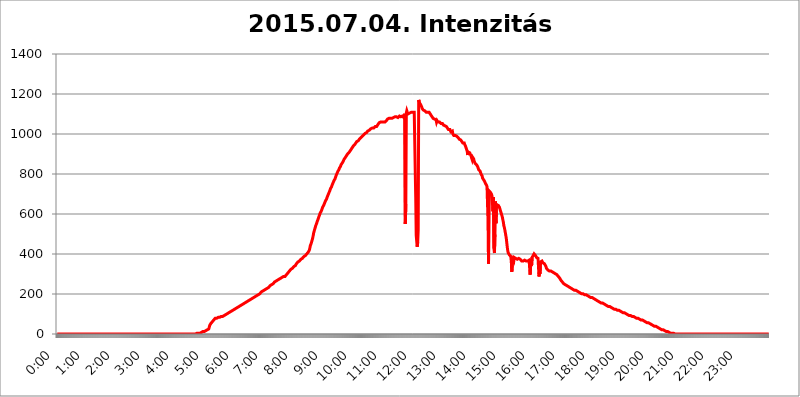
| Category | 2015.07.04. Intenzitás [W/m^2] |
|---|---|
| 0.0 | 0 |
| 0.0006944444444444445 | 0 |
| 0.001388888888888889 | 0 |
| 0.0020833333333333333 | 0 |
| 0.002777777777777778 | 0 |
| 0.003472222222222222 | 0 |
| 0.004166666666666667 | 0 |
| 0.004861111111111111 | 0 |
| 0.005555555555555556 | 0 |
| 0.0062499999999999995 | 0 |
| 0.006944444444444444 | 0 |
| 0.007638888888888889 | 0 |
| 0.008333333333333333 | 0 |
| 0.009027777777777779 | 0 |
| 0.009722222222222222 | 0 |
| 0.010416666666666666 | 0 |
| 0.011111111111111112 | 0 |
| 0.011805555555555555 | 0 |
| 0.012499999999999999 | 0 |
| 0.013194444444444444 | 0 |
| 0.013888888888888888 | 0 |
| 0.014583333333333332 | 0 |
| 0.015277777777777777 | 0 |
| 0.015972222222222224 | 0 |
| 0.016666666666666666 | 0 |
| 0.017361111111111112 | 0 |
| 0.018055555555555557 | 0 |
| 0.01875 | 0 |
| 0.019444444444444445 | 0 |
| 0.02013888888888889 | 0 |
| 0.020833333333333332 | 0 |
| 0.02152777777777778 | 0 |
| 0.022222222222222223 | 0 |
| 0.02291666666666667 | 0 |
| 0.02361111111111111 | 0 |
| 0.024305555555555556 | 0 |
| 0.024999999999999998 | 0 |
| 0.025694444444444447 | 0 |
| 0.02638888888888889 | 0 |
| 0.027083333333333334 | 0 |
| 0.027777777777777776 | 0 |
| 0.02847222222222222 | 0 |
| 0.029166666666666664 | 0 |
| 0.029861111111111113 | 0 |
| 0.030555555555555555 | 0 |
| 0.03125 | 0 |
| 0.03194444444444445 | 0 |
| 0.03263888888888889 | 0 |
| 0.03333333333333333 | 0 |
| 0.034027777777777775 | 0 |
| 0.034722222222222224 | 0 |
| 0.035416666666666666 | 0 |
| 0.036111111111111115 | 0 |
| 0.03680555555555556 | 0 |
| 0.0375 | 0 |
| 0.03819444444444444 | 0 |
| 0.03888888888888889 | 0 |
| 0.03958333333333333 | 0 |
| 0.04027777777777778 | 0 |
| 0.04097222222222222 | 0 |
| 0.041666666666666664 | 0 |
| 0.042361111111111106 | 0 |
| 0.04305555555555556 | 0 |
| 0.043750000000000004 | 0 |
| 0.044444444444444446 | 0 |
| 0.04513888888888889 | 0 |
| 0.04583333333333334 | 0 |
| 0.04652777777777778 | 0 |
| 0.04722222222222222 | 0 |
| 0.04791666666666666 | 0 |
| 0.04861111111111111 | 0 |
| 0.049305555555555554 | 0 |
| 0.049999999999999996 | 0 |
| 0.05069444444444445 | 0 |
| 0.051388888888888894 | 0 |
| 0.052083333333333336 | 0 |
| 0.05277777777777778 | 0 |
| 0.05347222222222222 | 0 |
| 0.05416666666666667 | 0 |
| 0.05486111111111111 | 0 |
| 0.05555555555555555 | 0 |
| 0.05625 | 0 |
| 0.05694444444444444 | 0 |
| 0.057638888888888885 | 0 |
| 0.05833333333333333 | 0 |
| 0.05902777777777778 | 0 |
| 0.059722222222222225 | 0 |
| 0.06041666666666667 | 0 |
| 0.061111111111111116 | 0 |
| 0.06180555555555556 | 0 |
| 0.0625 | 0 |
| 0.06319444444444444 | 0 |
| 0.06388888888888888 | 0 |
| 0.06458333333333334 | 0 |
| 0.06527777777777778 | 0 |
| 0.06597222222222222 | 0 |
| 0.06666666666666667 | 0 |
| 0.06736111111111111 | 0 |
| 0.06805555555555555 | 0 |
| 0.06874999999999999 | 0 |
| 0.06944444444444443 | 0 |
| 0.07013888888888889 | 0 |
| 0.07083333333333333 | 0 |
| 0.07152777777777779 | 0 |
| 0.07222222222222223 | 0 |
| 0.07291666666666667 | 0 |
| 0.07361111111111111 | 0 |
| 0.07430555555555556 | 0 |
| 0.075 | 0 |
| 0.07569444444444444 | 0 |
| 0.0763888888888889 | 0 |
| 0.07708333333333334 | 0 |
| 0.07777777777777778 | 0 |
| 0.07847222222222222 | 0 |
| 0.07916666666666666 | 0 |
| 0.0798611111111111 | 0 |
| 0.08055555555555556 | 0 |
| 0.08125 | 0 |
| 0.08194444444444444 | 0 |
| 0.08263888888888889 | 0 |
| 0.08333333333333333 | 0 |
| 0.08402777777777777 | 0 |
| 0.08472222222222221 | 0 |
| 0.08541666666666665 | 0 |
| 0.08611111111111112 | 0 |
| 0.08680555555555557 | 0 |
| 0.08750000000000001 | 0 |
| 0.08819444444444445 | 0 |
| 0.08888888888888889 | 0 |
| 0.08958333333333333 | 0 |
| 0.09027777777777778 | 0 |
| 0.09097222222222222 | 0 |
| 0.09166666666666667 | 0 |
| 0.09236111111111112 | 0 |
| 0.09305555555555556 | 0 |
| 0.09375 | 0 |
| 0.09444444444444444 | 0 |
| 0.09513888888888888 | 0 |
| 0.09583333333333333 | 0 |
| 0.09652777777777777 | 0 |
| 0.09722222222222222 | 0 |
| 0.09791666666666667 | 0 |
| 0.09861111111111111 | 0 |
| 0.09930555555555555 | 0 |
| 0.09999999999999999 | 0 |
| 0.10069444444444443 | 0 |
| 0.1013888888888889 | 0 |
| 0.10208333333333335 | 0 |
| 0.10277777777777779 | 0 |
| 0.10347222222222223 | 0 |
| 0.10416666666666667 | 0 |
| 0.10486111111111111 | 0 |
| 0.10555555555555556 | 0 |
| 0.10625 | 0 |
| 0.10694444444444444 | 0 |
| 0.1076388888888889 | 0 |
| 0.10833333333333334 | 0 |
| 0.10902777777777778 | 0 |
| 0.10972222222222222 | 0 |
| 0.1111111111111111 | 0 |
| 0.11180555555555556 | 0 |
| 0.11180555555555556 | 0 |
| 0.1125 | 0 |
| 0.11319444444444444 | 0 |
| 0.11388888888888889 | 0 |
| 0.11458333333333333 | 0 |
| 0.11527777777777777 | 0 |
| 0.11597222222222221 | 0 |
| 0.11666666666666665 | 0 |
| 0.1173611111111111 | 0 |
| 0.11805555555555557 | 0 |
| 0.11944444444444445 | 0 |
| 0.12013888888888889 | 0 |
| 0.12083333333333333 | 0 |
| 0.12152777777777778 | 0 |
| 0.12222222222222223 | 0 |
| 0.12291666666666667 | 0 |
| 0.12291666666666667 | 0 |
| 0.12361111111111112 | 0 |
| 0.12430555555555556 | 0 |
| 0.125 | 0 |
| 0.12569444444444444 | 0 |
| 0.12638888888888888 | 0 |
| 0.12708333333333333 | 0 |
| 0.16875 | 0 |
| 0.12847222222222224 | 0 |
| 0.12916666666666668 | 0 |
| 0.12986111111111112 | 0 |
| 0.13055555555555556 | 0 |
| 0.13125 | 0 |
| 0.13194444444444445 | 0 |
| 0.1326388888888889 | 0 |
| 0.13333333333333333 | 0 |
| 0.13402777777777777 | 0 |
| 0.13402777777777777 | 0 |
| 0.13472222222222222 | 0 |
| 0.13541666666666666 | 0 |
| 0.1361111111111111 | 0 |
| 0.13749999999999998 | 0 |
| 0.13819444444444443 | 0 |
| 0.1388888888888889 | 0 |
| 0.13958333333333334 | 0 |
| 0.14027777777777778 | 0 |
| 0.14097222222222222 | 0 |
| 0.14166666666666666 | 0 |
| 0.1423611111111111 | 0 |
| 0.14305555555555557 | 0 |
| 0.14375000000000002 | 0 |
| 0.14444444444444446 | 0 |
| 0.1451388888888889 | 0 |
| 0.1451388888888889 | 0 |
| 0.14652777777777778 | 0 |
| 0.14722222222222223 | 0 |
| 0.14791666666666667 | 0 |
| 0.1486111111111111 | 0 |
| 0.14930555555555555 | 0 |
| 0.15 | 0 |
| 0.15069444444444444 | 0 |
| 0.15138888888888888 | 0 |
| 0.15208333333333332 | 0 |
| 0.15277777777777776 | 0 |
| 0.15347222222222223 | 0 |
| 0.15416666666666667 | 0 |
| 0.15486111111111112 | 0 |
| 0.15555555555555556 | 0 |
| 0.15625 | 0 |
| 0.15694444444444444 | 0 |
| 0.15763888888888888 | 0 |
| 0.15833333333333333 | 0 |
| 0.15902777777777777 | 0 |
| 0.15972222222222224 | 0 |
| 0.16041666666666668 | 0 |
| 0.16111111111111112 | 0 |
| 0.16180555555555556 | 0 |
| 0.1625 | 0 |
| 0.16319444444444445 | 0 |
| 0.1638888888888889 | 0 |
| 0.16458333333333333 | 0 |
| 0.16527777777777777 | 0 |
| 0.16597222222222222 | 0 |
| 0.16666666666666666 | 0 |
| 0.1673611111111111 | 0 |
| 0.16805555555555554 | 0 |
| 0.16874999999999998 | 0 |
| 0.16944444444444443 | 0 |
| 0.17013888888888887 | 0 |
| 0.1708333333333333 | 0 |
| 0.17152777777777775 | 0 |
| 0.17222222222222225 | 0 |
| 0.1729166666666667 | 0 |
| 0.17361111111111113 | 0 |
| 0.17430555555555557 | 0 |
| 0.17500000000000002 | 0 |
| 0.17569444444444446 | 0 |
| 0.1763888888888889 | 0 |
| 0.17708333333333334 | 0 |
| 0.17777777777777778 | 0 |
| 0.17847222222222223 | 0 |
| 0.17916666666666667 | 0 |
| 0.1798611111111111 | 0 |
| 0.18055555555555555 | 0 |
| 0.18125 | 0 |
| 0.18194444444444444 | 0 |
| 0.1826388888888889 | 0 |
| 0.18333333333333335 | 0 |
| 0.1840277777777778 | 0 |
| 0.18472222222222223 | 0 |
| 0.18541666666666667 | 0 |
| 0.18611111111111112 | 0 |
| 0.18680555555555556 | 0 |
| 0.1875 | 0 |
| 0.18819444444444444 | 0 |
| 0.18888888888888888 | 0 |
| 0.18958333333333333 | 0 |
| 0.19027777777777777 | 0 |
| 0.1909722222222222 | 0 |
| 0.19166666666666665 | 0 |
| 0.19236111111111112 | 0 |
| 0.19305555555555554 | 0 |
| 0.19375 | 0 |
| 0.19444444444444445 | 0 |
| 0.1951388888888889 | 3.525 |
| 0.19583333333333333 | 3.525 |
| 0.19652777777777777 | 3.525 |
| 0.19722222222222222 | 3.525 |
| 0.19791666666666666 | 3.525 |
| 0.1986111111111111 | 3.525 |
| 0.19930555555555554 | 3.525 |
| 0.19999999999999998 | 3.525 |
| 0.20069444444444443 | 7.887 |
| 0.20138888888888887 | 7.887 |
| 0.2020833333333333 | 7.887 |
| 0.2027777777777778 | 7.887 |
| 0.2034722222222222 | 7.887 |
| 0.2041666666666667 | 12.257 |
| 0.20486111111111113 | 12.257 |
| 0.20555555555555557 | 12.257 |
| 0.20625000000000002 | 12.257 |
| 0.20694444444444446 | 16.636 |
| 0.2076388888888889 | 16.636 |
| 0.20833333333333334 | 16.636 |
| 0.20902777777777778 | 21.024 |
| 0.20972222222222223 | 21.024 |
| 0.21041666666666667 | 21.024 |
| 0.2111111111111111 | 25.419 |
| 0.21180555555555555 | 25.419 |
| 0.2125 | 25.419 |
| 0.21319444444444444 | 34.234 |
| 0.2138888888888889 | 43.079 |
| 0.21458333333333335 | 47.511 |
| 0.2152777777777778 | 51.951 |
| 0.21597222222222223 | 56.398 |
| 0.21666666666666667 | 56.398 |
| 0.21736111111111112 | 60.85 |
| 0.21805555555555556 | 65.31 |
| 0.21875 | 65.31 |
| 0.21944444444444444 | 69.775 |
| 0.22013888888888888 | 69.775 |
| 0.22083333333333333 | 74.246 |
| 0.22152777777777777 | 78.722 |
| 0.2222222222222222 | 78.722 |
| 0.22291666666666665 | 83.205 |
| 0.2236111111111111 | 78.722 |
| 0.22430555555555556 | 78.722 |
| 0.225 | 78.722 |
| 0.22569444444444445 | 83.205 |
| 0.2263888888888889 | 83.205 |
| 0.22708333333333333 | 83.205 |
| 0.22777777777777777 | 83.205 |
| 0.22847222222222222 | 87.692 |
| 0.22916666666666666 | 87.692 |
| 0.2298611111111111 | 87.692 |
| 0.23055555555555554 | 87.692 |
| 0.23124999999999998 | 87.692 |
| 0.23194444444444443 | 87.692 |
| 0.23263888888888887 | 87.692 |
| 0.2333333333333333 | 92.184 |
| 0.2340277777777778 | 92.184 |
| 0.2347222222222222 | 92.184 |
| 0.2354166666666667 | 96.682 |
| 0.23611111111111113 | 96.682 |
| 0.23680555555555557 | 96.682 |
| 0.23750000000000002 | 101.184 |
| 0.23819444444444446 | 101.184 |
| 0.2388888888888889 | 101.184 |
| 0.23958333333333334 | 105.69 |
| 0.24027777777777778 | 105.69 |
| 0.24097222222222223 | 110.201 |
| 0.24166666666666667 | 110.201 |
| 0.2423611111111111 | 110.201 |
| 0.24305555555555555 | 114.716 |
| 0.24375 | 114.716 |
| 0.24444444444444446 | 114.716 |
| 0.24513888888888888 | 119.235 |
| 0.24583333333333335 | 119.235 |
| 0.2465277777777778 | 119.235 |
| 0.24722222222222223 | 119.235 |
| 0.24791666666666667 | 123.758 |
| 0.24861111111111112 | 123.758 |
| 0.24930555555555556 | 123.758 |
| 0.25 | 128.284 |
| 0.25069444444444444 | 128.284 |
| 0.2513888888888889 | 128.284 |
| 0.2520833333333333 | 128.284 |
| 0.25277777777777777 | 132.814 |
| 0.2534722222222222 | 132.814 |
| 0.25416666666666665 | 137.347 |
| 0.2548611111111111 | 137.347 |
| 0.2555555555555556 | 137.347 |
| 0.25625000000000003 | 137.347 |
| 0.2569444444444445 | 141.884 |
| 0.2576388888888889 | 141.884 |
| 0.25833333333333336 | 141.884 |
| 0.2590277777777778 | 146.423 |
| 0.25972222222222224 | 146.423 |
| 0.2604166666666667 | 146.423 |
| 0.2611111111111111 | 150.964 |
| 0.26180555555555557 | 150.964 |
| 0.2625 | 150.964 |
| 0.26319444444444445 | 155.509 |
| 0.2638888888888889 | 155.509 |
| 0.26458333333333334 | 155.509 |
| 0.2652777777777778 | 160.056 |
| 0.2659722222222222 | 160.056 |
| 0.26666666666666666 | 160.056 |
| 0.2673611111111111 | 164.605 |
| 0.26805555555555555 | 164.605 |
| 0.26875 | 164.605 |
| 0.26944444444444443 | 169.156 |
| 0.2701388888888889 | 169.156 |
| 0.2708333333333333 | 169.156 |
| 0.27152777777777776 | 173.709 |
| 0.2722222222222222 | 173.709 |
| 0.27291666666666664 | 173.709 |
| 0.2736111111111111 | 178.264 |
| 0.2743055555555555 | 178.264 |
| 0.27499999999999997 | 178.264 |
| 0.27569444444444446 | 182.82 |
| 0.27638888888888885 | 182.82 |
| 0.27708333333333335 | 182.82 |
| 0.2777777777777778 | 187.378 |
| 0.27847222222222223 | 187.378 |
| 0.2791666666666667 | 187.378 |
| 0.2798611111111111 | 191.937 |
| 0.28055555555555556 | 191.937 |
| 0.28125 | 191.937 |
| 0.28194444444444444 | 196.497 |
| 0.2826388888888889 | 196.497 |
| 0.2833333333333333 | 201.058 |
| 0.28402777777777777 | 201.058 |
| 0.2847222222222222 | 201.058 |
| 0.28541666666666665 | 205.62 |
| 0.28611111111111115 | 210.182 |
| 0.28680555555555554 | 210.182 |
| 0.28750000000000003 | 210.182 |
| 0.2881944444444445 | 214.746 |
| 0.2888888888888889 | 214.746 |
| 0.28958333333333336 | 214.746 |
| 0.2902777777777778 | 219.309 |
| 0.29097222222222224 | 219.309 |
| 0.2916666666666667 | 219.309 |
| 0.2923611111111111 | 223.873 |
| 0.29305555555555557 | 228.436 |
| 0.29375 | 228.436 |
| 0.29444444444444445 | 228.436 |
| 0.2951388888888889 | 233 |
| 0.29583333333333334 | 233 |
| 0.2965277777777778 | 233 |
| 0.2972222222222222 | 237.564 |
| 0.29791666666666666 | 237.564 |
| 0.2986111111111111 | 242.127 |
| 0.29930555555555555 | 242.127 |
| 0.3 | 242.127 |
| 0.30069444444444443 | 246.689 |
| 0.3013888888888889 | 251.251 |
| 0.3020833333333333 | 251.251 |
| 0.30277777777777776 | 251.251 |
| 0.3034722222222222 | 255.813 |
| 0.30416666666666664 | 255.813 |
| 0.3048611111111111 | 260.373 |
| 0.3055555555555555 | 260.373 |
| 0.30624999999999997 | 260.373 |
| 0.3069444444444444 | 264.932 |
| 0.3076388888888889 | 264.932 |
| 0.30833333333333335 | 269.49 |
| 0.3090277777777778 | 269.49 |
| 0.30972222222222223 | 269.49 |
| 0.3104166666666667 | 274.047 |
| 0.3111111111111111 | 274.047 |
| 0.31180555555555556 | 274.047 |
| 0.3125 | 278.603 |
| 0.31319444444444444 | 278.603 |
| 0.3138888888888889 | 278.603 |
| 0.3145833333333333 | 278.603 |
| 0.31527777777777777 | 283.156 |
| 0.3159722222222222 | 283.156 |
| 0.31666666666666665 | 283.156 |
| 0.31736111111111115 | 287.709 |
| 0.31805555555555554 | 287.709 |
| 0.31875000000000003 | 287.709 |
| 0.3194444444444445 | 287.709 |
| 0.3201388888888889 | 292.259 |
| 0.32083333333333336 | 292.259 |
| 0.3215277777777778 | 296.808 |
| 0.32222222222222224 | 296.808 |
| 0.3229166666666667 | 301.354 |
| 0.3236111111111111 | 305.898 |
| 0.32430555555555557 | 305.898 |
| 0.325 | 310.44 |
| 0.32569444444444445 | 314.98 |
| 0.3263888888888889 | 314.98 |
| 0.32708333333333334 | 319.517 |
| 0.3277777777777778 | 324.052 |
| 0.3284722222222222 | 324.052 |
| 0.32916666666666666 | 328.584 |
| 0.3298611111111111 | 328.584 |
| 0.33055555555555555 | 333.113 |
| 0.33125 | 333.113 |
| 0.33194444444444443 | 337.639 |
| 0.3326388888888889 | 342.162 |
| 0.3333333333333333 | 342.162 |
| 0.3340277777777778 | 342.162 |
| 0.3347222222222222 | 346.682 |
| 0.3354166666666667 | 351.198 |
| 0.3361111111111111 | 351.198 |
| 0.3368055555555556 | 355.712 |
| 0.33749999999999997 | 360.221 |
| 0.33819444444444446 | 360.221 |
| 0.33888888888888885 | 360.221 |
| 0.33958333333333335 | 364.728 |
| 0.34027777777777773 | 369.23 |
| 0.34097222222222223 | 369.23 |
| 0.3416666666666666 | 373.729 |
| 0.3423611111111111 | 373.729 |
| 0.3430555555555555 | 378.224 |
| 0.34375 | 378.224 |
| 0.3444444444444445 | 382.715 |
| 0.3451388888888889 | 382.715 |
| 0.3458333333333334 | 387.202 |
| 0.34652777777777777 | 387.202 |
| 0.34722222222222227 | 391.685 |
| 0.34791666666666665 | 391.685 |
| 0.34861111111111115 | 396.164 |
| 0.34930555555555554 | 396.164 |
| 0.35000000000000003 | 400.638 |
| 0.3506944444444444 | 405.108 |
| 0.3513888888888889 | 405.108 |
| 0.3520833333333333 | 409.574 |
| 0.3527777777777778 | 414.035 |
| 0.3534722222222222 | 418.492 |
| 0.3541666666666667 | 427.39 |
| 0.3548611111111111 | 440.702 |
| 0.35555555555555557 | 445.129 |
| 0.35625 | 453.968 |
| 0.35694444444444445 | 462.786 |
| 0.3576388888888889 | 471.582 |
| 0.35833333333333334 | 480.356 |
| 0.3590277777777778 | 493.475 |
| 0.3597222222222222 | 506.542 |
| 0.36041666666666666 | 515.223 |
| 0.3611111111111111 | 523.88 |
| 0.36180555555555555 | 532.513 |
| 0.3625 | 541.121 |
| 0.36319444444444443 | 545.416 |
| 0.3638888888888889 | 553.986 |
| 0.3645833333333333 | 562.53 |
| 0.3652777777777778 | 566.793 |
| 0.3659722222222222 | 575.299 |
| 0.3666666666666667 | 583.779 |
| 0.3673611111111111 | 588.009 |
| 0.3680555555555556 | 596.45 |
| 0.36874999999999997 | 604.864 |
| 0.36944444444444446 | 609.062 |
| 0.37013888888888885 | 613.252 |
| 0.37083333333333335 | 617.436 |
| 0.37152777777777773 | 625.784 |
| 0.37222222222222223 | 634.105 |
| 0.3729166666666666 | 638.256 |
| 0.3736111111111111 | 642.4 |
| 0.3743055555555555 | 646.537 |
| 0.375 | 654.791 |
| 0.3756944444444445 | 658.909 |
| 0.3763888888888889 | 667.123 |
| 0.3770833333333334 | 671.22 |
| 0.37777777777777777 | 675.311 |
| 0.37847222222222227 | 683.473 |
| 0.37916666666666665 | 687.544 |
| 0.37986111111111115 | 695.666 |
| 0.38055555555555554 | 699.717 |
| 0.38125000000000003 | 707.8 |
| 0.3819444444444444 | 711.832 |
| 0.3826388888888889 | 719.877 |
| 0.3833333333333333 | 727.896 |
| 0.3840277777777778 | 731.896 |
| 0.3847222222222222 | 735.89 |
| 0.3854166666666667 | 743.859 |
| 0.3861111111111111 | 747.834 |
| 0.38680555555555557 | 755.766 |
| 0.3875 | 759.723 |
| 0.38819444444444445 | 767.62 |
| 0.3888888888888889 | 771.559 |
| 0.38958333333333334 | 775.492 |
| 0.3902777777777778 | 783.342 |
| 0.3909722222222222 | 791.169 |
| 0.39166666666666666 | 795.074 |
| 0.3923611111111111 | 802.868 |
| 0.39305555555555555 | 806.757 |
| 0.39375 | 814.519 |
| 0.39444444444444443 | 818.392 |
| 0.3951388888888889 | 822.26 |
| 0.3958333333333333 | 829.981 |
| 0.3965277777777778 | 833.834 |
| 0.3972222222222222 | 837.682 |
| 0.3979166666666667 | 845.365 |
| 0.3986111111111111 | 849.199 |
| 0.3993055555555556 | 853.029 |
| 0.39999999999999997 | 856.855 |
| 0.40069444444444446 | 860.676 |
| 0.40138888888888885 | 864.493 |
| 0.40208333333333335 | 872.114 |
| 0.40277777777777773 | 875.918 |
| 0.40347222222222223 | 879.719 |
| 0.4041666666666666 | 883.516 |
| 0.4048611111111111 | 887.309 |
| 0.4055555555555555 | 891.099 |
| 0.40625 | 894.885 |
| 0.4069444444444445 | 894.885 |
| 0.4076388888888889 | 902.447 |
| 0.4083333333333334 | 906.223 |
| 0.40902777777777777 | 906.223 |
| 0.40972222222222227 | 909.996 |
| 0.41041666666666665 | 913.766 |
| 0.41111111111111115 | 917.534 |
| 0.41180555555555554 | 921.298 |
| 0.41250000000000003 | 925.06 |
| 0.4131944444444444 | 928.819 |
| 0.4138888888888889 | 932.576 |
| 0.4145833333333333 | 936.33 |
| 0.4152777777777778 | 940.082 |
| 0.4159722222222222 | 943.832 |
| 0.4166666666666667 | 943.832 |
| 0.4173611111111111 | 947.58 |
| 0.41805555555555557 | 951.327 |
| 0.41875 | 955.071 |
| 0.41944444444444445 | 958.814 |
| 0.4201388888888889 | 962.555 |
| 0.42083333333333334 | 962.555 |
| 0.4215277777777778 | 966.295 |
| 0.4222222222222222 | 966.295 |
| 0.42291666666666666 | 970.034 |
| 0.4236111111111111 | 973.772 |
| 0.42430555555555555 | 973.772 |
| 0.425 | 977.508 |
| 0.42569444444444443 | 981.244 |
| 0.4263888888888889 | 984.98 |
| 0.4270833333333333 | 984.98 |
| 0.4277777777777778 | 988.714 |
| 0.4284722222222222 | 988.714 |
| 0.4291666666666667 | 992.448 |
| 0.4298611111111111 | 996.182 |
| 0.4305555555555556 | 999.916 |
| 0.43124999999999997 | 999.916 |
| 0.43194444444444446 | 1003.65 |
| 0.43263888888888885 | 1003.65 |
| 0.43333333333333335 | 1007.383 |
| 0.43402777777777773 | 1007.383 |
| 0.43472222222222223 | 1011.118 |
| 0.4354166666666666 | 1014.852 |
| 0.4361111111111111 | 1014.852 |
| 0.4368055555555555 | 1018.587 |
| 0.4375 | 1018.587 |
| 0.4381944444444445 | 1022.323 |
| 0.4388888888888889 | 1022.323 |
| 0.4395833333333334 | 1026.06 |
| 0.44027777777777777 | 1029.798 |
| 0.44097222222222227 | 1029.798 |
| 0.44166666666666665 | 1029.798 |
| 0.44236111111111115 | 1029.798 |
| 0.44305555555555554 | 1029.798 |
| 0.44375000000000003 | 1029.798 |
| 0.4444444444444444 | 1033.537 |
| 0.4451388888888889 | 1033.537 |
| 0.4458333333333333 | 1037.277 |
| 0.4465277777777778 | 1037.277 |
| 0.4472222222222222 | 1041.019 |
| 0.4479166666666667 | 1037.277 |
| 0.4486111111111111 | 1041.019 |
| 0.44930555555555557 | 1044.762 |
| 0.45 | 1044.762 |
| 0.45069444444444445 | 1048.508 |
| 0.4513888888888889 | 1056.004 |
| 0.45208333333333334 | 1056.004 |
| 0.4527777777777778 | 1059.756 |
| 0.4534722222222222 | 1059.756 |
| 0.45416666666666666 | 1059.756 |
| 0.4548611111111111 | 1059.756 |
| 0.45555555555555555 | 1059.756 |
| 0.45625 | 1056.004 |
| 0.45694444444444443 | 1059.756 |
| 0.4576388888888889 | 1059.756 |
| 0.4583333333333333 | 1059.756 |
| 0.4590277777777778 | 1059.756 |
| 0.4597222222222222 | 1059.756 |
| 0.4604166666666667 | 1063.51 |
| 0.4611111111111111 | 1063.51 |
| 0.4618055555555556 | 1067.267 |
| 0.46249999999999997 | 1071.027 |
| 0.46319444444444446 | 1074.789 |
| 0.46388888888888885 | 1074.789 |
| 0.46458333333333335 | 1078.555 |
| 0.46527777777777773 | 1078.555 |
| 0.46597222222222223 | 1078.555 |
| 0.4666666666666666 | 1082.324 |
| 0.4673611111111111 | 1078.555 |
| 0.4680555555555555 | 1078.555 |
| 0.46875 | 1074.789 |
| 0.4694444444444445 | 1078.555 |
| 0.4701388888888889 | 1082.324 |
| 0.4708333333333334 | 1082.324 |
| 0.47152777777777777 | 1082.324 |
| 0.47222222222222227 | 1082.324 |
| 0.47291666666666665 | 1086.097 |
| 0.47361111111111115 | 1086.097 |
| 0.47430555555555554 | 1086.097 |
| 0.47500000000000003 | 1086.097 |
| 0.4756944444444444 | 1086.097 |
| 0.4763888888888889 | 1086.097 |
| 0.4770833333333333 | 1082.324 |
| 0.4777777777777778 | 1082.324 |
| 0.4784722222222222 | 1082.324 |
| 0.4791666666666667 | 1082.324 |
| 0.4798611111111111 | 1089.873 |
| 0.48055555555555557 | 1086.097 |
| 0.48125 | 1086.097 |
| 0.48194444444444445 | 1086.097 |
| 0.4826388888888889 | 1086.097 |
| 0.48333333333333334 | 1086.097 |
| 0.4840277777777778 | 1089.873 |
| 0.4847222222222222 | 1086.097 |
| 0.48541666666666666 | 1086.097 |
| 0.4861111111111111 | 1082.324 |
| 0.48680555555555555 | 1078.555 |
| 0.4875 | 1101.226 |
| 0.48819444444444443 | 549.704 |
| 0.4888888888888889 | 650.667 |
| 0.4895833333333333 | 1105.019 |
| 0.4902777777777778 | 1116.426 |
| 0.4909722222222222 | 1108.816 |
| 0.4916666666666667 | 1105.019 |
| 0.4923611111111111 | 1101.226 |
| 0.4930555555555556 | 1101.226 |
| 0.49374999999999997 | 1101.226 |
| 0.49444444444444446 | 1105.019 |
| 0.49513888888888885 | 1105.019 |
| 0.49583333333333335 | 1108.816 |
| 0.49652777777777773 | 1108.816 |
| 0.49722222222222223 | 1108.816 |
| 0.4979166666666666 | 1108.816 |
| 0.4986111111111111 | 1108.816 |
| 0.4993055555555555 | 1108.816 |
| 0.5 | 1112.618 |
| 0.5006944444444444 | 1108.816 |
| 0.5013888888888889 | 1105.019 |
| 0.5020833333333333 | 818.392 |
| 0.5027777777777778 | 683.473 |
| 0.5034722222222222 | 493.475 |
| 0.5041666666666667 | 462.786 |
| 0.5048611111111111 | 436.27 |
| 0.5055555555555555 | 458.38 |
| 0.50625 | 519.555 |
| 0.5069444444444444 | 1170.358 |
| 0.5076388888888889 | 1162.571 |
| 0.5083333333333333 | 1154.814 |
| 0.5090277777777777 | 1154.814 |
| 0.5097222222222222 | 1147.086 |
| 0.5104166666666666 | 1143.232 |
| 0.5111111111111112 | 1135.543 |
| 0.5118055555555555 | 1127.879 |
| 0.5125000000000001 | 1124.056 |
| 0.5131944444444444 | 1120.238 |
| 0.513888888888889 | 1120.238 |
| 0.5145833333333333 | 1116.426 |
| 0.5152777777777778 | 1116.426 |
| 0.5159722222222222 | 1116.426 |
| 0.5166666666666667 | 1112.618 |
| 0.517361111111111 | 1108.816 |
| 0.5180555555555556 | 1108.816 |
| 0.5187499999999999 | 1108.816 |
| 0.5194444444444445 | 1108.816 |
| 0.5201388888888888 | 1108.816 |
| 0.5208333333333334 | 1112.618 |
| 0.5215277777777778 | 1108.816 |
| 0.5222222222222223 | 1105.019 |
| 0.5229166666666667 | 1101.226 |
| 0.5236111111111111 | 1097.437 |
| 0.5243055555555556 | 1093.653 |
| 0.525 | 1089.873 |
| 0.5256944444444445 | 1086.097 |
| 0.5263888888888889 | 1082.324 |
| 0.5270833333333333 | 1078.555 |
| 0.5277777777777778 | 1074.789 |
| 0.5284722222222222 | 1078.555 |
| 0.5291666666666667 | 1074.789 |
| 0.5298611111111111 | 1074.789 |
| 0.5305555555555556 | 1071.027 |
| 0.53125 | 1071.027 |
| 0.5319444444444444 | 1059.756 |
| 0.5326388888888889 | 1067.267 |
| 0.5333333333333333 | 1063.51 |
| 0.5340277777777778 | 1059.756 |
| 0.5347222222222222 | 1063.51 |
| 0.5354166666666667 | 1059.756 |
| 0.5361111111111111 | 1059.756 |
| 0.5368055555555555 | 1056.004 |
| 0.5375 | 1056.004 |
| 0.5381944444444444 | 1052.255 |
| 0.5388888888888889 | 1052.255 |
| 0.5395833333333333 | 1052.255 |
| 0.5402777777777777 | 1052.255 |
| 0.5409722222222222 | 1048.508 |
| 0.5416666666666666 | 1044.762 |
| 0.5423611111111112 | 1044.762 |
| 0.5430555555555555 | 1044.762 |
| 0.5437500000000001 | 1041.019 |
| 0.5444444444444444 | 1041.019 |
| 0.545138888888889 | 1041.019 |
| 0.5458333333333333 | 1037.277 |
| 0.5465277777777778 | 1037.277 |
| 0.5472222222222222 | 1029.798 |
| 0.5479166666666667 | 1029.798 |
| 0.548611111111111 | 1022.323 |
| 0.5493055555555556 | 1026.06 |
| 0.5499999999999999 | 1022.323 |
| 0.5506944444444445 | 1022.323 |
| 0.5513888888888888 | 1026.06 |
| 0.5520833333333334 | 1011.118 |
| 0.5527777777777778 | 1007.383 |
| 0.5534722222222223 | 1007.383 |
| 0.5541666666666667 | 1014.852 |
| 0.5548611111111111 | 999.916 |
| 0.5555555555555556 | 999.916 |
| 0.55625 | 992.448 |
| 0.5569444444444445 | 996.182 |
| 0.5576388888888889 | 992.448 |
| 0.5583333333333333 | 992.448 |
| 0.5590277777777778 | 992.448 |
| 0.5597222222222222 | 988.714 |
| 0.5604166666666667 | 988.714 |
| 0.5611111111111111 | 984.98 |
| 0.5618055555555556 | 984.98 |
| 0.5625 | 981.244 |
| 0.5631944444444444 | 977.508 |
| 0.5638888888888889 | 973.772 |
| 0.5645833333333333 | 973.772 |
| 0.5652777777777778 | 970.034 |
| 0.5659722222222222 | 970.034 |
| 0.5666666666666667 | 966.295 |
| 0.5673611111111111 | 962.555 |
| 0.5680555555555555 | 958.814 |
| 0.56875 | 955.071 |
| 0.5694444444444444 | 955.071 |
| 0.5701388888888889 | 955.071 |
| 0.5708333333333333 | 955.071 |
| 0.5715277777777777 | 947.58 |
| 0.5722222222222222 | 943.832 |
| 0.5729166666666666 | 936.33 |
| 0.5736111111111112 | 928.819 |
| 0.5743055555555555 | 925.06 |
| 0.5750000000000001 | 913.766 |
| 0.5756944444444444 | 894.885 |
| 0.576388888888889 | 909.996 |
| 0.5770833333333333 | 909.996 |
| 0.5777777777777778 | 913.766 |
| 0.5784722222222222 | 906.223 |
| 0.5791666666666667 | 902.447 |
| 0.579861111111111 | 894.885 |
| 0.5805555555555556 | 887.309 |
| 0.5812499999999999 | 887.309 |
| 0.5819444444444445 | 872.114 |
| 0.5826388888888888 | 883.516 |
| 0.5833333333333334 | 879.719 |
| 0.5840277777777778 | 875.918 |
| 0.5847222222222223 | 864.493 |
| 0.5854166666666667 | 860.676 |
| 0.5861111111111111 | 853.029 |
| 0.5868055555555556 | 853.029 |
| 0.5875 | 853.029 |
| 0.5881944444444445 | 845.365 |
| 0.5888888888888889 | 841.526 |
| 0.5895833333333333 | 837.682 |
| 0.5902777777777778 | 829.981 |
| 0.5909722222222222 | 822.26 |
| 0.5916666666666667 | 822.26 |
| 0.5923611111111111 | 818.392 |
| 0.5930555555555556 | 814.519 |
| 0.59375 | 806.757 |
| 0.5944444444444444 | 798.974 |
| 0.5951388888888889 | 795.074 |
| 0.5958333333333333 | 791.169 |
| 0.5965277777777778 | 779.42 |
| 0.5972222222222222 | 775.492 |
| 0.5979166666666667 | 771.559 |
| 0.5986111111111111 | 767.62 |
| 0.5993055555555555 | 763.674 |
| 0.6 | 759.723 |
| 0.6006944444444444 | 751.803 |
| 0.6013888888888889 | 747.834 |
| 0.6020833333333333 | 743.859 |
| 0.6027777777777777 | 735.89 |
| 0.6034722222222222 | 735.89 |
| 0.6041666666666666 | 566.793 |
| 0.6048611111111112 | 351.198 |
| 0.6055555555555555 | 715.858 |
| 0.6062500000000001 | 715.858 |
| 0.6069444444444444 | 711.832 |
| 0.607638888888889 | 707.8 |
| 0.6083333333333333 | 703.762 |
| 0.6090277777777778 | 699.717 |
| 0.6097222222222222 | 691.608 |
| 0.6104166666666667 | 695.666 |
| 0.611111111111111 | 613.252 |
| 0.6118055555555556 | 683.473 |
| 0.6124999999999999 | 427.39 |
| 0.6131944444444445 | 405.108 |
| 0.6138888888888888 | 497.836 |
| 0.6145833333333334 | 663.019 |
| 0.6152777777777778 | 553.986 |
| 0.6159722222222223 | 638.256 |
| 0.6166666666666667 | 646.537 |
| 0.6173611111111111 | 642.4 |
| 0.6180555555555556 | 642.4 |
| 0.61875 | 642.4 |
| 0.6194444444444445 | 638.256 |
| 0.6201388888888889 | 634.105 |
| 0.6208333333333333 | 625.784 |
| 0.6215277777777778 | 617.436 |
| 0.6222222222222222 | 609.062 |
| 0.6229166666666667 | 600.661 |
| 0.6236111111111111 | 592.233 |
| 0.6243055555555556 | 583.779 |
| 0.625 | 571.049 |
| 0.6256944444444444 | 558.261 |
| 0.6263888888888889 | 541.121 |
| 0.6270833333333333 | 532.513 |
| 0.6277777777777778 | 519.555 |
| 0.6284722222222222 | 506.542 |
| 0.6291666666666667 | 502.192 |
| 0.6298611111111111 | 475.972 |
| 0.6305555555555555 | 453.968 |
| 0.63125 | 431.833 |
| 0.6319444444444444 | 414.035 |
| 0.6326388888888889 | 405.108 |
| 0.6333333333333333 | 400.638 |
| 0.6340277777777777 | 396.164 |
| 0.6347222222222222 | 396.164 |
| 0.6354166666666666 | 391.685 |
| 0.6361111111111112 | 387.202 |
| 0.6368055555555555 | 364.728 |
| 0.6375000000000001 | 310.44 |
| 0.6381944444444444 | 305.898 |
| 0.638888888888889 | 373.729 |
| 0.6395833333333333 | 378.224 |
| 0.6402777777777778 | 364.728 |
| 0.6409722222222222 | 382.715 |
| 0.6416666666666667 | 387.202 |
| 0.642361111111111 | 382.715 |
| 0.6430555555555556 | 378.224 |
| 0.6437499999999999 | 373.729 |
| 0.6444444444444445 | 373.729 |
| 0.6451388888888888 | 373.729 |
| 0.6458333333333334 | 373.729 |
| 0.6465277777777778 | 373.729 |
| 0.6472222222222223 | 378.224 |
| 0.6479166666666667 | 378.224 |
| 0.6486111111111111 | 373.729 |
| 0.6493055555555556 | 373.729 |
| 0.65 | 369.23 |
| 0.6506944444444445 | 369.23 |
| 0.6513888888888889 | 364.728 |
| 0.6520833333333333 | 360.221 |
| 0.6527777777777778 | 360.221 |
| 0.6534722222222222 | 364.728 |
| 0.6541666666666667 | 364.728 |
| 0.6548611111111111 | 369.23 |
| 0.6555555555555556 | 369.23 |
| 0.65625 | 369.23 |
| 0.6569444444444444 | 369.23 |
| 0.6576388888888889 | 364.728 |
| 0.6583333333333333 | 360.221 |
| 0.6590277777777778 | 364.728 |
| 0.6597222222222222 | 364.728 |
| 0.6604166666666667 | 369.23 |
| 0.6611111111111111 | 369.23 |
| 0.6618055555555555 | 369.23 |
| 0.6625 | 364.728 |
| 0.6631944444444444 | 296.808 |
| 0.6638888888888889 | 333.113 |
| 0.6645833333333333 | 373.729 |
| 0.6652777777777777 | 342.162 |
| 0.6659722222222222 | 382.715 |
| 0.6666666666666666 | 387.202 |
| 0.6673611111111111 | 391.685 |
| 0.6680555555555556 | 396.164 |
| 0.6687500000000001 | 400.638 |
| 0.6694444444444444 | 396.164 |
| 0.6701388888888888 | 396.164 |
| 0.6708333333333334 | 391.685 |
| 0.6715277777777778 | 391.685 |
| 0.6722222222222222 | 382.715 |
| 0.6729166666666666 | 382.715 |
| 0.6736111111111112 | 382.715 |
| 0.6743055555555556 | 378.224 |
| 0.6749999999999999 | 378.224 |
| 0.6756944444444444 | 287.709 |
| 0.6763888888888889 | 314.98 |
| 0.6770833333333334 | 301.354 |
| 0.6777777777777777 | 360.221 |
| 0.6784722222222223 | 360.221 |
| 0.6791666666666667 | 360.221 |
| 0.6798611111111111 | 364.728 |
| 0.6805555555555555 | 360.221 |
| 0.68125 | 355.712 |
| 0.6819444444444445 | 351.198 |
| 0.6826388888888889 | 351.198 |
| 0.6833333333333332 | 351.198 |
| 0.6840277777777778 | 351.198 |
| 0.6847222222222222 | 346.682 |
| 0.6854166666666667 | 337.639 |
| 0.686111111111111 | 328.584 |
| 0.6868055555555556 | 324.052 |
| 0.6875 | 324.052 |
| 0.6881944444444444 | 319.517 |
| 0.688888888888889 | 314.98 |
| 0.6895833333333333 | 314.98 |
| 0.6902777777777778 | 314.98 |
| 0.6909722222222222 | 314.98 |
| 0.6916666666666668 | 310.44 |
| 0.6923611111111111 | 314.98 |
| 0.6930555555555555 | 310.44 |
| 0.69375 | 310.44 |
| 0.6944444444444445 | 310.44 |
| 0.6951388888888889 | 310.44 |
| 0.6958333333333333 | 310.44 |
| 0.6965277777777777 | 305.898 |
| 0.6972222222222223 | 305.898 |
| 0.6979166666666666 | 305.898 |
| 0.6986111111111111 | 301.354 |
| 0.6993055555555556 | 301.354 |
| 0.7000000000000001 | 301.354 |
| 0.7006944444444444 | 296.808 |
| 0.7013888888888888 | 292.259 |
| 0.7020833333333334 | 292.259 |
| 0.7027777777777778 | 287.709 |
| 0.7034722222222222 | 287.709 |
| 0.7041666666666666 | 283.156 |
| 0.7048611111111112 | 278.603 |
| 0.7055555555555556 | 274.047 |
| 0.7062499999999999 | 269.49 |
| 0.7069444444444444 | 269.49 |
| 0.7076388888888889 | 264.932 |
| 0.7083333333333334 | 260.373 |
| 0.7090277777777777 | 260.373 |
| 0.7097222222222223 | 255.813 |
| 0.7104166666666667 | 251.251 |
| 0.7111111111111111 | 251.251 |
| 0.7118055555555555 | 251.251 |
| 0.7125 | 246.689 |
| 0.7131944444444445 | 246.689 |
| 0.7138888888888889 | 242.127 |
| 0.7145833333333332 | 242.127 |
| 0.7152777777777778 | 242.127 |
| 0.7159722222222222 | 237.564 |
| 0.7166666666666667 | 237.564 |
| 0.717361111111111 | 233 |
| 0.7180555555555556 | 233 |
| 0.71875 | 233 |
| 0.7194444444444444 | 233 |
| 0.720138888888889 | 228.436 |
| 0.7208333333333333 | 228.436 |
| 0.7215277777777778 | 228.436 |
| 0.7222222222222222 | 228.436 |
| 0.7229166666666668 | 223.873 |
| 0.7236111111111111 | 223.873 |
| 0.7243055555555555 | 223.873 |
| 0.725 | 219.309 |
| 0.7256944444444445 | 219.309 |
| 0.7263888888888889 | 219.309 |
| 0.7270833333333333 | 219.309 |
| 0.7277777777777777 | 219.309 |
| 0.7284722222222223 | 214.746 |
| 0.7291666666666666 | 214.746 |
| 0.7298611111111111 | 210.182 |
| 0.7305555555555556 | 210.182 |
| 0.7312500000000001 | 210.182 |
| 0.7319444444444444 | 210.182 |
| 0.7326388888888888 | 205.62 |
| 0.7333333333333334 | 205.62 |
| 0.7340277777777778 | 205.62 |
| 0.7347222222222222 | 205.62 |
| 0.7354166666666666 | 201.058 |
| 0.7361111111111112 | 201.058 |
| 0.7368055555555556 | 201.058 |
| 0.7374999999999999 | 201.058 |
| 0.7381944444444444 | 201.058 |
| 0.7388888888888889 | 201.058 |
| 0.7395833333333334 | 196.497 |
| 0.7402777777777777 | 196.497 |
| 0.7409722222222223 | 196.497 |
| 0.7416666666666667 | 196.497 |
| 0.7423611111111111 | 191.937 |
| 0.7430555555555555 | 191.937 |
| 0.74375 | 191.937 |
| 0.7444444444444445 | 187.378 |
| 0.7451388888888889 | 187.378 |
| 0.7458333333333332 | 187.378 |
| 0.7465277777777778 | 187.378 |
| 0.7472222222222222 | 182.82 |
| 0.7479166666666667 | 182.82 |
| 0.748611111111111 | 182.82 |
| 0.7493055555555556 | 182.82 |
| 0.75 | 182.82 |
| 0.7506944444444444 | 178.264 |
| 0.751388888888889 | 178.264 |
| 0.7520833333333333 | 178.264 |
| 0.7527777777777778 | 173.709 |
| 0.7534722222222222 | 173.709 |
| 0.7541666666666668 | 173.709 |
| 0.7548611111111111 | 169.156 |
| 0.7555555555555555 | 169.156 |
| 0.75625 | 169.156 |
| 0.7569444444444445 | 164.605 |
| 0.7576388888888889 | 164.605 |
| 0.7583333333333333 | 164.605 |
| 0.7590277777777777 | 164.605 |
| 0.7597222222222223 | 164.605 |
| 0.7604166666666666 | 160.056 |
| 0.7611111111111111 | 160.056 |
| 0.7618055555555556 | 160.056 |
| 0.7625000000000001 | 155.509 |
| 0.7631944444444444 | 155.509 |
| 0.7638888888888888 | 155.509 |
| 0.7645833333333334 | 155.509 |
| 0.7652777777777778 | 150.964 |
| 0.7659722222222222 | 150.964 |
| 0.7666666666666666 | 150.964 |
| 0.7673611111111112 | 146.423 |
| 0.7680555555555556 | 146.423 |
| 0.7687499999999999 | 146.423 |
| 0.7694444444444444 | 146.423 |
| 0.7701388888888889 | 146.423 |
| 0.7708333333333334 | 141.884 |
| 0.7715277777777777 | 141.884 |
| 0.7722222222222223 | 141.884 |
| 0.7729166666666667 | 137.347 |
| 0.7736111111111111 | 137.347 |
| 0.7743055555555555 | 137.347 |
| 0.775 | 137.347 |
| 0.7756944444444445 | 137.347 |
| 0.7763888888888889 | 132.814 |
| 0.7770833333333332 | 132.814 |
| 0.7777777777777778 | 128.284 |
| 0.7784722222222222 | 128.284 |
| 0.7791666666666667 | 128.284 |
| 0.779861111111111 | 128.284 |
| 0.7805555555555556 | 128.284 |
| 0.78125 | 123.758 |
| 0.7819444444444444 | 123.758 |
| 0.782638888888889 | 123.758 |
| 0.7833333333333333 | 123.758 |
| 0.7840277777777778 | 119.235 |
| 0.7847222222222222 | 119.235 |
| 0.7854166666666668 | 119.235 |
| 0.7861111111111111 | 119.235 |
| 0.7868055555555555 | 119.235 |
| 0.7875 | 119.235 |
| 0.7881944444444445 | 114.716 |
| 0.7888888888888889 | 114.716 |
| 0.7895833333333333 | 114.716 |
| 0.7902777777777777 | 110.201 |
| 0.7909722222222223 | 110.201 |
| 0.7916666666666666 | 110.201 |
| 0.7923611111111111 | 110.201 |
| 0.7930555555555556 | 110.201 |
| 0.7937500000000001 | 105.69 |
| 0.7944444444444444 | 105.69 |
| 0.7951388888888888 | 105.69 |
| 0.7958333333333334 | 105.69 |
| 0.7965277777777778 | 101.184 |
| 0.7972222222222222 | 101.184 |
| 0.7979166666666666 | 101.184 |
| 0.7986111111111112 | 101.184 |
| 0.7993055555555556 | 101.184 |
| 0.7999999999999999 | 96.682 |
| 0.8006944444444444 | 96.682 |
| 0.8013888888888889 | 96.682 |
| 0.8020833333333334 | 92.184 |
| 0.8027777777777777 | 92.184 |
| 0.8034722222222223 | 92.184 |
| 0.8041666666666667 | 92.184 |
| 0.8048611111111111 | 92.184 |
| 0.8055555555555555 | 87.692 |
| 0.80625 | 87.692 |
| 0.8069444444444445 | 87.692 |
| 0.8076388888888889 | 87.692 |
| 0.8083333333333332 | 87.692 |
| 0.8090277777777778 | 83.205 |
| 0.8097222222222222 | 83.205 |
| 0.8104166666666667 | 83.205 |
| 0.811111111111111 | 83.205 |
| 0.8118055555555556 | 83.205 |
| 0.8125 | 78.722 |
| 0.8131944444444444 | 78.722 |
| 0.813888888888889 | 78.722 |
| 0.8145833333333333 | 78.722 |
| 0.8152777777777778 | 74.246 |
| 0.8159722222222222 | 74.246 |
| 0.8166666666666668 | 74.246 |
| 0.8173611111111111 | 74.246 |
| 0.8180555555555555 | 74.246 |
| 0.81875 | 69.775 |
| 0.8194444444444445 | 69.775 |
| 0.8201388888888889 | 69.775 |
| 0.8208333333333333 | 69.775 |
| 0.8215277777777777 | 65.31 |
| 0.8222222222222223 | 65.31 |
| 0.8229166666666666 | 65.31 |
| 0.8236111111111111 | 65.31 |
| 0.8243055555555556 | 65.31 |
| 0.8250000000000001 | 60.85 |
| 0.8256944444444444 | 60.85 |
| 0.8263888888888888 | 60.85 |
| 0.8270833333333334 | 56.398 |
| 0.8277777777777778 | 56.398 |
| 0.8284722222222222 | 56.398 |
| 0.8291666666666666 | 56.398 |
| 0.8298611111111112 | 56.398 |
| 0.8305555555555556 | 51.951 |
| 0.8312499999999999 | 51.951 |
| 0.8319444444444444 | 51.951 |
| 0.8326388888888889 | 47.511 |
| 0.8333333333333334 | 47.511 |
| 0.8340277777777777 | 47.511 |
| 0.8347222222222223 | 47.511 |
| 0.8354166666666667 | 43.079 |
| 0.8361111111111111 | 43.079 |
| 0.8368055555555555 | 43.079 |
| 0.8375 | 38.653 |
| 0.8381944444444445 | 38.653 |
| 0.8388888888888889 | 38.653 |
| 0.8395833333333332 | 38.653 |
| 0.8402777777777778 | 38.653 |
| 0.8409722222222222 | 38.653 |
| 0.8416666666666667 | 34.234 |
| 0.842361111111111 | 34.234 |
| 0.8430555555555556 | 29.823 |
| 0.84375 | 29.823 |
| 0.8444444444444444 | 29.823 |
| 0.845138888888889 | 29.823 |
| 0.8458333333333333 | 25.419 |
| 0.8465277777777778 | 25.419 |
| 0.8472222222222222 | 25.419 |
| 0.8479166666666668 | 21.024 |
| 0.8486111111111111 | 21.024 |
| 0.8493055555555555 | 21.024 |
| 0.85 | 21.024 |
| 0.8506944444444445 | 21.024 |
| 0.8513888888888889 | 21.024 |
| 0.8520833333333333 | 16.636 |
| 0.8527777777777777 | 16.636 |
| 0.8534722222222223 | 16.636 |
| 0.8541666666666666 | 12.257 |
| 0.8548611111111111 | 12.257 |
| 0.8555555555555556 | 12.257 |
| 0.8562500000000001 | 12.257 |
| 0.8569444444444444 | 12.257 |
| 0.8576388888888888 | 7.887 |
| 0.8583333333333334 | 7.887 |
| 0.8590277777777778 | 7.887 |
| 0.8597222222222222 | 7.887 |
| 0.8604166666666666 | 3.525 |
| 0.8611111111111112 | 3.525 |
| 0.8618055555555556 | 3.525 |
| 0.8624999999999999 | 3.525 |
| 0.8631944444444444 | 3.525 |
| 0.8638888888888889 | 3.525 |
| 0.8645833333333334 | 3.525 |
| 0.8652777777777777 | 3.525 |
| 0.8659722222222223 | 3.525 |
| 0.8666666666666667 | 0 |
| 0.8673611111111111 | 0 |
| 0.8680555555555555 | 0 |
| 0.86875 | 0 |
| 0.8694444444444445 | 0 |
| 0.8701388888888889 | 0 |
| 0.8708333333333332 | 0 |
| 0.8715277777777778 | 0 |
| 0.8722222222222222 | 0 |
| 0.8729166666666667 | 0 |
| 0.873611111111111 | 0 |
| 0.8743055555555556 | 0 |
| 0.875 | 0 |
| 0.8756944444444444 | 0 |
| 0.876388888888889 | 0 |
| 0.8770833333333333 | 0 |
| 0.8777777777777778 | 0 |
| 0.8784722222222222 | 0 |
| 0.8791666666666668 | 0 |
| 0.8798611111111111 | 0 |
| 0.8805555555555555 | 0 |
| 0.88125 | 0 |
| 0.8819444444444445 | 0 |
| 0.8826388888888889 | 0 |
| 0.8833333333333333 | 0 |
| 0.8840277777777777 | 0 |
| 0.8847222222222223 | 0 |
| 0.8854166666666666 | 0 |
| 0.8861111111111111 | 0 |
| 0.8868055555555556 | 0 |
| 0.8875000000000001 | 0 |
| 0.8881944444444444 | 0 |
| 0.8888888888888888 | 0 |
| 0.8895833333333334 | 0 |
| 0.8902777777777778 | 0 |
| 0.8909722222222222 | 0 |
| 0.8916666666666666 | 0 |
| 0.8923611111111112 | 0 |
| 0.8930555555555556 | 0 |
| 0.8937499999999999 | 0 |
| 0.8944444444444444 | 0 |
| 0.8951388888888889 | 0 |
| 0.8958333333333334 | 0 |
| 0.8965277777777777 | 0 |
| 0.8972222222222223 | 0 |
| 0.8979166666666667 | 0 |
| 0.8986111111111111 | 0 |
| 0.8993055555555555 | 0 |
| 0.9 | 0 |
| 0.9006944444444445 | 0 |
| 0.9013888888888889 | 0 |
| 0.9020833333333332 | 0 |
| 0.9027777777777778 | 0 |
| 0.9034722222222222 | 0 |
| 0.9041666666666667 | 0 |
| 0.904861111111111 | 0 |
| 0.9055555555555556 | 0 |
| 0.90625 | 0 |
| 0.9069444444444444 | 0 |
| 0.907638888888889 | 0 |
| 0.9083333333333333 | 0 |
| 0.9090277777777778 | 0 |
| 0.9097222222222222 | 0 |
| 0.9104166666666668 | 0 |
| 0.9111111111111111 | 0 |
| 0.9118055555555555 | 0 |
| 0.9125 | 0 |
| 0.9131944444444445 | 0 |
| 0.9138888888888889 | 0 |
| 0.9145833333333333 | 0 |
| 0.9152777777777777 | 0 |
| 0.9159722222222223 | 0 |
| 0.9166666666666666 | 0 |
| 0.9173611111111111 | 0 |
| 0.9180555555555556 | 0 |
| 0.9187500000000001 | 0 |
| 0.9194444444444444 | 0 |
| 0.9201388888888888 | 0 |
| 0.9208333333333334 | 0 |
| 0.9215277777777778 | 0 |
| 0.9222222222222222 | 0 |
| 0.9229166666666666 | 0 |
| 0.9236111111111112 | 0 |
| 0.9243055555555556 | 0 |
| 0.9249999999999999 | 0 |
| 0.9256944444444444 | 0 |
| 0.9263888888888889 | 0 |
| 0.9270833333333334 | 0 |
| 0.9277777777777777 | 0 |
| 0.9284722222222223 | 0 |
| 0.9291666666666667 | 0 |
| 0.9298611111111111 | 0 |
| 0.9305555555555555 | 0 |
| 0.93125 | 0 |
| 0.9319444444444445 | 0 |
| 0.9326388888888889 | 0 |
| 0.9333333333333332 | 0 |
| 0.9340277777777778 | 0 |
| 0.9347222222222222 | 0 |
| 0.9354166666666667 | 0 |
| 0.936111111111111 | 0 |
| 0.9368055555555556 | 0 |
| 0.9375 | 0 |
| 0.9381944444444444 | 0 |
| 0.938888888888889 | 0 |
| 0.9395833333333333 | 0 |
| 0.9402777777777778 | 0 |
| 0.9409722222222222 | 0 |
| 0.9416666666666668 | 0 |
| 0.9423611111111111 | 0 |
| 0.9430555555555555 | 0 |
| 0.94375 | 0 |
| 0.9444444444444445 | 0 |
| 0.9451388888888889 | 0 |
| 0.9458333333333333 | 0 |
| 0.9465277777777777 | 0 |
| 0.9472222222222223 | 0 |
| 0.9479166666666666 | 0 |
| 0.9486111111111111 | 0 |
| 0.9493055555555556 | 0 |
| 0.9500000000000001 | 0 |
| 0.9506944444444444 | 0 |
| 0.9513888888888888 | 0 |
| 0.9520833333333334 | 0 |
| 0.9527777777777778 | 0 |
| 0.9534722222222222 | 0 |
| 0.9541666666666666 | 0 |
| 0.9548611111111112 | 0 |
| 0.9555555555555556 | 0 |
| 0.9562499999999999 | 0 |
| 0.9569444444444444 | 0 |
| 0.9576388888888889 | 0 |
| 0.9583333333333334 | 0 |
| 0.9590277777777777 | 0 |
| 0.9597222222222223 | 0 |
| 0.9604166666666667 | 0 |
| 0.9611111111111111 | 0 |
| 0.9618055555555555 | 0 |
| 0.9625 | 0 |
| 0.9631944444444445 | 0 |
| 0.9638888888888889 | 0 |
| 0.9645833333333332 | 0 |
| 0.9652777777777778 | 0 |
| 0.9659722222222222 | 0 |
| 0.9666666666666667 | 0 |
| 0.967361111111111 | 0 |
| 0.9680555555555556 | 0 |
| 0.96875 | 0 |
| 0.9694444444444444 | 0 |
| 0.970138888888889 | 0 |
| 0.9708333333333333 | 0 |
| 0.9715277777777778 | 0 |
| 0.9722222222222222 | 0 |
| 0.9729166666666668 | 0 |
| 0.9736111111111111 | 0 |
| 0.9743055555555555 | 0 |
| 0.975 | 0 |
| 0.9756944444444445 | 0 |
| 0.9763888888888889 | 0 |
| 0.9770833333333333 | 0 |
| 0.9777777777777777 | 0 |
| 0.9784722222222223 | 0 |
| 0.9791666666666666 | 0 |
| 0.9798611111111111 | 0 |
| 0.9805555555555556 | 0 |
| 0.9812500000000001 | 0 |
| 0.9819444444444444 | 0 |
| 0.9826388888888888 | 0 |
| 0.9833333333333334 | 0 |
| 0.9840277777777778 | 0 |
| 0.9847222222222222 | 0 |
| 0.9854166666666666 | 0 |
| 0.9861111111111112 | 0 |
| 0.9868055555555556 | 0 |
| 0.9874999999999999 | 0 |
| 0.9881944444444444 | 0 |
| 0.9888888888888889 | 0 |
| 0.9895833333333334 | 0 |
| 0.9902777777777777 | 0 |
| 0.9909722222222223 | 0 |
| 0.9916666666666667 | 0 |
| 0.9923611111111111 | 0 |
| 0.9930555555555555 | 0 |
| 0.99375 | 0 |
| 0.9944444444444445 | 0 |
| 0.9951388888888889 | 0 |
| 0.9958333333333332 | 0 |
| 0.9965277777777778 | 0 |
| 0.9972222222222222 | 0 |
| 0.9979166666666667 | 0 |
| 0.998611111111111 | 0 |
| 0.9993055555555556 | 0 |